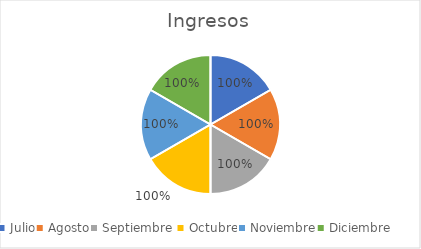
| Category | Series 0 |
|---|---|
| Julio | 1 |
| Agosto | 1 |
| Septiembre  | 1 |
| Octubre | 1 |
| Noviembre | 1 |
| Diciembre | 1 |